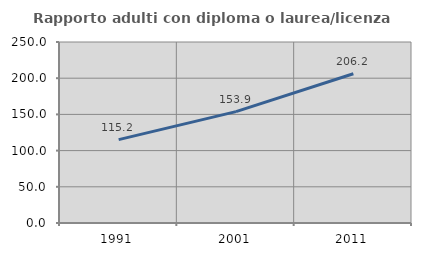
| Category | Rapporto adulti con diploma o laurea/licenza media  |
|---|---|
| 1991.0 | 115.215 |
| 2001.0 | 153.873 |
| 2011.0 | 206.177 |